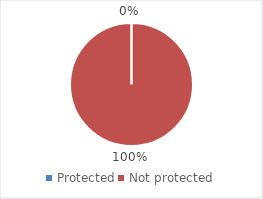
| Category | Series 0 |
|---|---|
| Protected | 0 |
| Not protected | 0.1 |